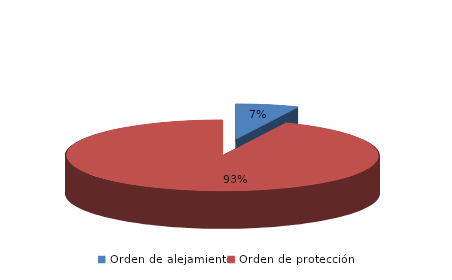
| Category | Series 0 |
|---|---|
| Orden de alejamiento | 62 |
| Orden de protección | 889 |